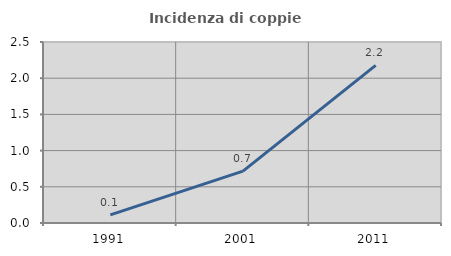
| Category | Incidenza di coppie miste |
|---|---|
| 1991.0 | 0.113 |
| 2001.0 | 0.716 |
| 2011.0 | 2.176 |